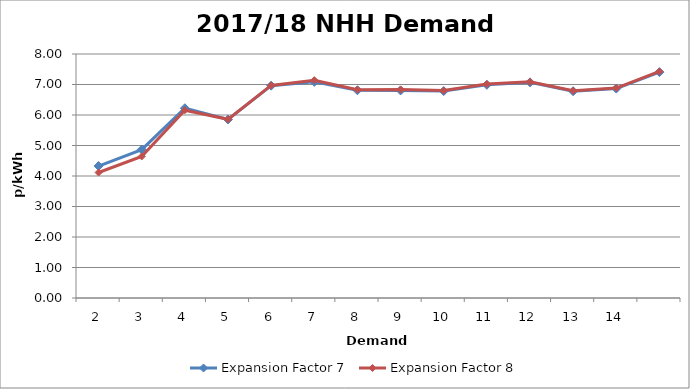
| Category | Expansion Factor 7 | Expansion Factor 8 |
|---|---|---|
| 2.0 | 4.327 | 4.115 |
| 3.0 | 4.866 | 4.641 |
| 4.0 | 6.221 | 6.158 |
| 5.0 | 5.853 | 5.858 |
| 6.0 | 6.962 | 6.97 |
| 7.0 | 7.088 | 7.142 |
| 8.0 | 6.812 | 6.831 |
| 9.0 | 6.806 | 6.837 |
| 10.0 | 6.786 | 6.8 |
| 11.0 | 6.99 | 7.015 |
| 12.0 | 7.07 | 7.087 |
| 13.0 | 6.779 | 6.793 |
| 14.0 | 6.866 | 6.884 |